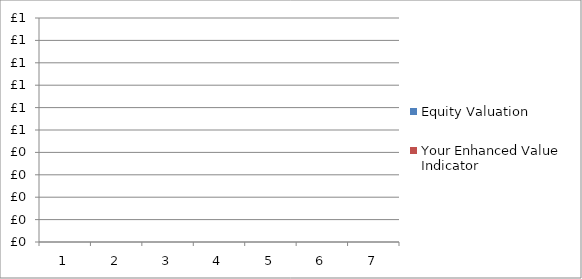
| Category | Equity Valuation | Your Enhanced Value Indicator |
|---|---|---|
| 0 | 0 | 0 |
| 1 | 0 | 0 |
| 2 | 0 | 0 |
| 3 | 0 | 0 |
| 4 | 0 | 0 |
| 5 | 0 | 0 |
| 6 | 0 | 0 |